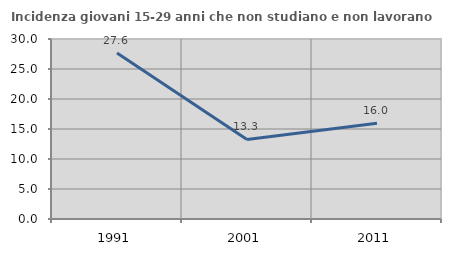
| Category | Incidenza giovani 15-29 anni che non studiano e non lavorano  |
|---|---|
| 1991.0 | 27.65 |
| 2001.0 | 13.257 |
| 2011.0 | 15.975 |